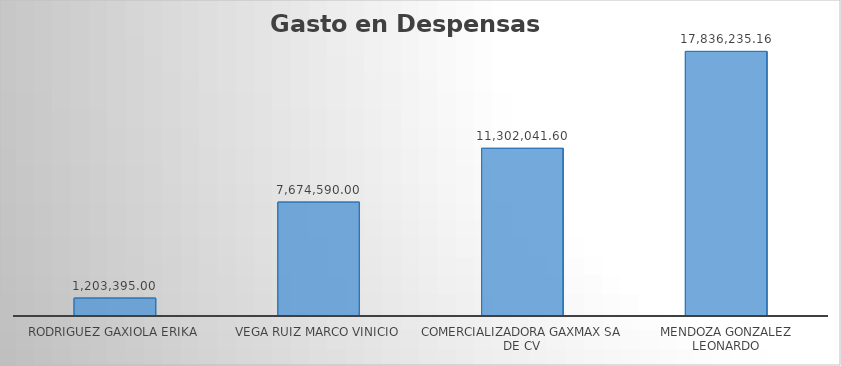
| Category | Suma |
|---|---|
| RODRIGUEZ GAXIOLA ERIKA | 1203395 |
| VEGA RUIZ MARCO VINICIO | 7674590 |
| COMERCIALIZADORA GAXMAX SA DE CV | 11302041.6 |
| MENDOZA GONZALEZ LEONARDO | 17836235.16 |